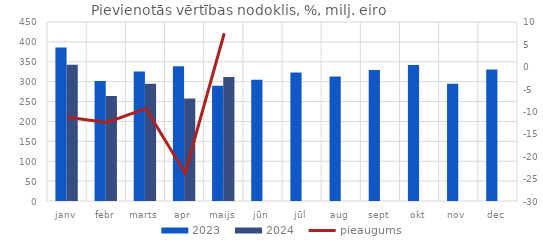
| Category | 2023 | 2024 |
|---|---|---|
| janv | 386.11 | 342.506 |
| febr | 301.806 | 264.233 |
| marts | 325.432 | 295.025 |
| apr | 338.499 | 257.977 |
| maijs | 289.733 | 311.421 |
| jūn | 305.091 | 0 |
| jūl | 323.284 | 0 |
| aug | 312.936 | 0 |
| sept | 329.266 | 0 |
| okt | 341.811 | 0 |
| nov | 294.749 | 0 |
| dec | 330.799 | 0 |